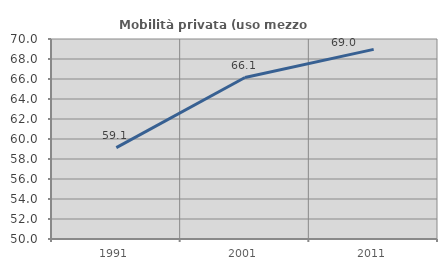
| Category | Mobilità privata (uso mezzo privato) |
|---|---|
| 1991.0 | 59.141 |
| 2001.0 | 66.144 |
| 2011.0 | 68.965 |